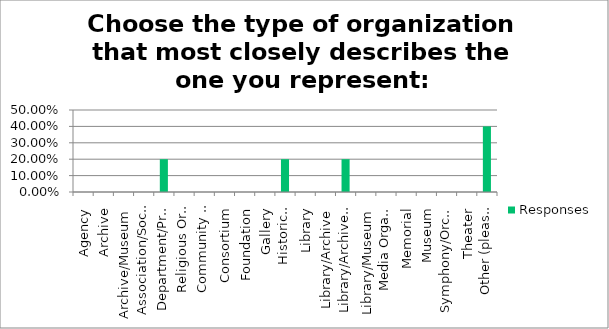
| Category | Responses |
|---|---|
| Agency | 0 |
| Archive | 0 |
| Archive/Museum | 0 |
| Association/Society | 0 |
| Department/Program | 0.2 |
| Religious Organization | 0 |
| Community Organization | 0 |
| Consortium | 0 |
| Foundation | 0 |
| Gallery | 0 |
| Historical Society | 0.2 |
| Library | 0 |
| Library/Archive | 0 |
| Library/Archive/Museum | 0.2 |
| Library/Museum | 0 |
| Media Organization | 0 |
| Memorial | 0 |
| Museum | 0 |
| Symphony/Orchestra | 0 |
| Theater | 0 |
| Other (please specify) | 0.4 |